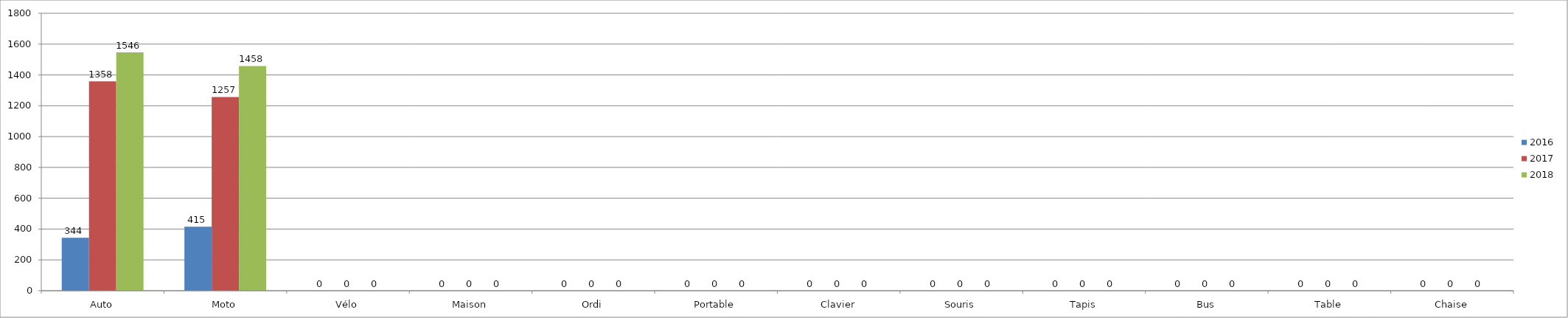
| Category | 2016 | 2017 | 2018 |
|---|---|---|---|
| Auto | 344 | 1358 | 1546 |
| Moto | 415 | 1257 | 1458 |
| Vélo | 0 | 0 | 0 |
| Maison | 0 | 0 | 0 |
| Ordi | 0 | 0 | 0 |
| Portable | 0 | 0 | 0 |
| Clavier | 0 | 0 | 0 |
| Souris | 0 | 0 | 0 |
| Tapis | 0 | 0 | 0 |
| Bus | 0 | 0 | 0 |
| Table | 0 | 0 | 0 |
| Chaise | 0 | 0 | 0 |